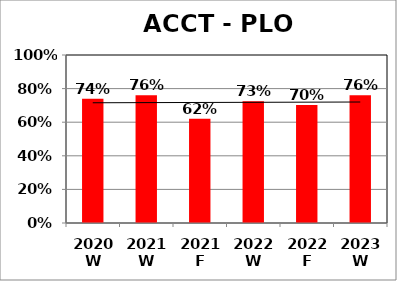
| Category | Series 0 |
|---|---|
| 2020 W | 0.74 |
| 2021 W | 0.76 |
| 2021 F | 0.62 |
| 2022 W | 0.725 |
| 2022 F | 0.702 |
| 2023 W | 0.76 |